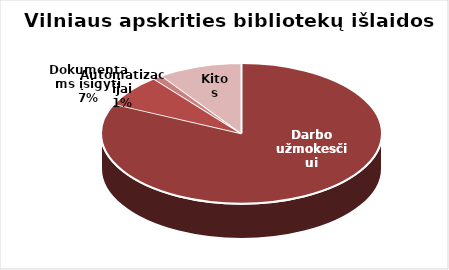
| Category | Series 0 |
|---|---|
| Darbo užmokesčiui | 6385948.94 |
| Dokumentams įsigyti | 573241.32 |
| Automatizacijai | 87120 |
| Kitos | 753292.72 |